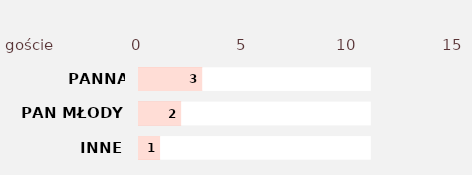
| Category | Series 2 | Series 3 | Series 1 | Series 0 |
|---|---|---|---|---|
| INNE | 11 | 1 | 11 | 1 |
| PAN MŁODY | 11 | 2 | 11 | 2 |
| PANNA MŁODA | 11 | 3 | 11 | 3 |